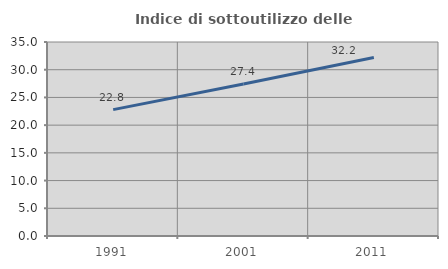
| Category | Indice di sottoutilizzo delle abitazioni  |
|---|---|
| 1991.0 | 22.798 |
| 2001.0 | 27.422 |
| 2011.0 | 32.204 |